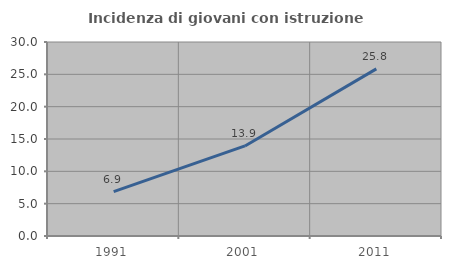
| Category | Incidenza di giovani con istruzione universitaria |
|---|---|
| 1991.0 | 6.865 |
| 2001.0 | 13.926 |
| 2011.0 | 25.843 |